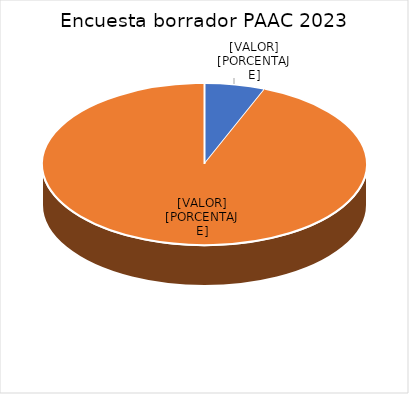
| Category | Series 0 |
|---|---|
| Participantes que tienen observaciones | 11 |
| Participantes que no tienen observaciones | 170 |